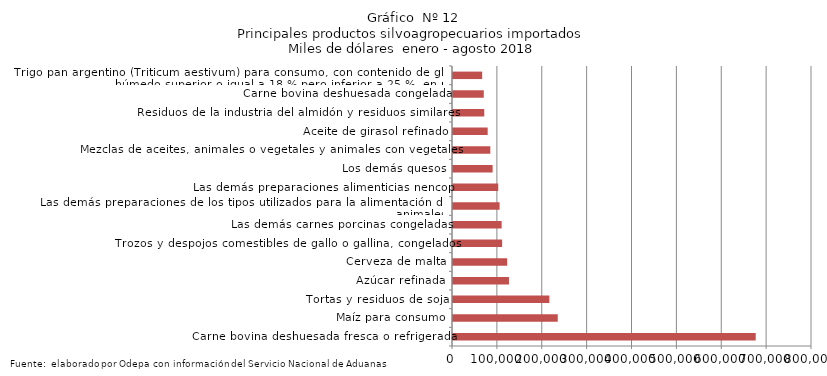
| Category | Series 0 |
|---|---|
| Carne bovina deshuesada fresca o refrigerada | 674552.603 |
| Maíz para consumo | 233425.192 |
| Tortas y residuos de soja | 214755.788 |
| Azúcar refinada | 124713.932 |
| Cerveza de malta | 120730.265 |
| Trozos y despojos comestibles de gallo o gallina, congelados | 109439.321 |
| Las demás carnes porcinas congeladas | 108382.413 |
| Las demás preparaciones de los tipos utilizados para la alimentación de los animales | 103789.976 |
| Las demás preparaciones alimenticias nencop | 100806.507 |
| Los demás quesos | 88281.98 |
| Mezclas de aceites, animales o vegetales y animales con vegetales | 83151.433 |
| Aceite de girasol refinado | 77258.452 |
| Residuos de la industria del almidón y residuos similares | 69692.855 |
| Carne bovina deshuesada congelada | 68584.175 |
| Trigo pan argentino (Triticum aestivum) para consumo, con contenido de gluten húmedo superior o igual a 18 % pero inferior a 25 %, en peso | 65018.302 |